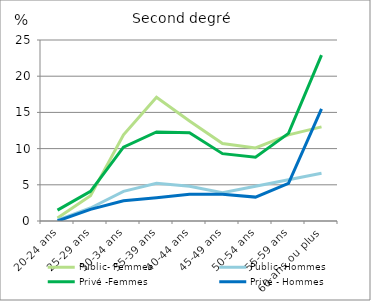
| Category | Public- Femmes | Public- Hommes | Privé -Femmes | Privé - Hommes |
|---|---|---|---|---|
| 20-24 ans | 0.4 | 0.1 | 1.5 | 0 |
| 25-29 ans | 3.5 | 1.8 | 4.1 | 1.6 |
| 30-34 ans | 11.9 | 4.1 | 10.2 | 2.8 |
| 35-39 ans | 17.1 | 5.2 | 12.3 | 3.2 |
| 40-44 ans | 13.8 | 4.8 | 12.2 | 3.7 |
| 45-49 ans | 10.7 | 3.9 | 9.3 | 3.7 |
| 50-54 ans | 10.1 | 4.8 | 8.8 | 3.3 |
| 55-59 ans | 11.9 | 5.7 | 12.1 | 5.2 |
| 60 ans ou plus | 13 | 6.6 | 22.9 | 15.5 |